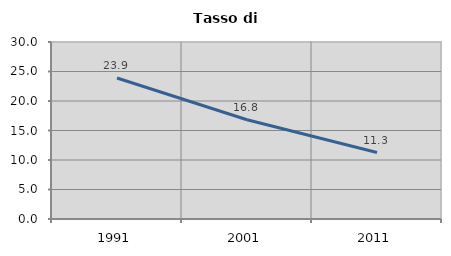
| Category | Tasso di disoccupazione   |
|---|---|
| 1991.0 | 23.902 |
| 2001.0 | 16.818 |
| 2011.0 | 11.261 |